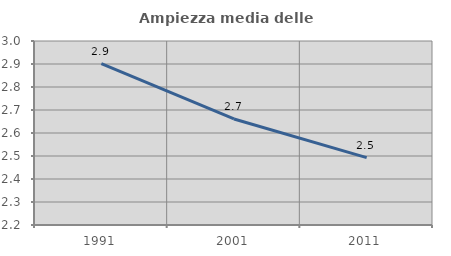
| Category | Ampiezza media delle famiglie |
|---|---|
| 1991.0 | 2.902 |
| 2001.0 | 2.661 |
| 2011.0 | 2.493 |